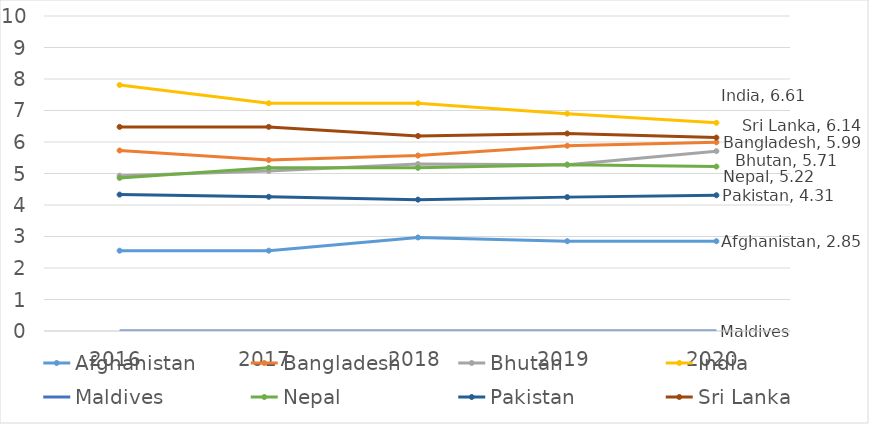
| Category | Afghanistan | Bangladesh | Bhutan | India | Maldives | Nepal | Pakistan | Sri Lanka |
|---|---|---|---|---|---|---|---|---|
| 2016.0 | 2.55 | 5.73 | 4.93 | 7.81 | 0 | 4.86 | 4.33 | 6.48 |
| 2017.0 | 2.55 | 5.43 | 5.08 | 7.23 | 0 | 5.18 | 4.26 | 6.48 |
| 2018.0 | 2.97 | 5.57 | 5.3 | 7.23 | 0 | 5.18 | 4.17 | 6.19 |
| 2019.0 | 2.85 | 5.88 | 5.28 | 6.9 | 0 | 5.28 | 4.25 | 6.27 |
| 2020.0 | 2.85 | 5.99 | 5.71 | 6.61 | 0 | 5.22 | 4.31 | 6.14 |